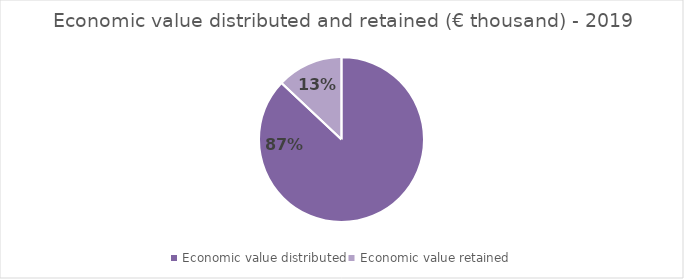
| Category | Series 0 |
|---|---|
| Economic value distributed | 2338379 |
| Economic value retained | 348743 |